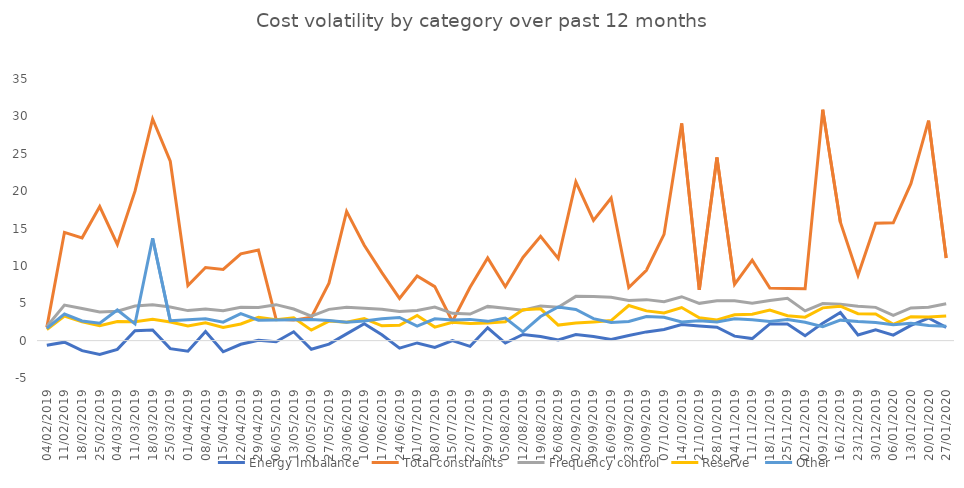
| Category | Energy Imbalance | Total constraints | Frequency control | Reserve | Other |
|---|---|---|---|---|---|
| 04/02/2019 | -0.617 | 1.772 | 1.891 | 1.495 | 1.643 |
| 11/02/2019 | -0.205 | 14.489 | 4.751 | 3.299 | 3.563 |
| 18/02/2019 | -1.342 | 13.752 | 4.289 | 2.515 | 2.635 |
| 25/02/2019 | -1.843 | 17.932 | 3.829 | 1.998 | 2.336 |
| 04/03/2019 | -1.174 | 12.864 | 3.928 | 2.569 | 4.103 |
| 11/03/2019 | 1.325 | 19.999 | 4.619 | 2.513 | 2.247 |
| 18/03/2019 | 1.423 | 29.65 | 4.798 | 2.844 | 13.688 |
| 25/03/2019 | -1.072 | 24.004 | 4.487 | 2.484 | 2.658 |
| 01/04/2019 | -1.405 | 7.368 | 4.017 | 1.95 | 2.778 |
| 08/04/2019 | 1.228 | 9.779 | 4.226 | 2.391 | 2.912 |
| 15/04/2019 | -1.495 | 9.524 | 4.007 | 1.761 | 2.468 |
| 22/04/2019 | -0.491 | 11.609 | 4.467 | 2.223 | 3.614 |
| 29/04/2019 | 0.051 | 12.118 | 4.442 | 3.122 | 2.737 |
| 06/05/2019 | -0.142 | 2.875 | 4.811 | 2.78 | 2.745 |
| 13/05/2019 | 1.189 | 2.744 | 4.226 | 3.061 | 2.801 |
| 20/05/2019 | -1.146 | 3.116 | 3.288 | 1.404 | 2.819 |
| 27/05/2019 | -0.467 | 7.685 | 4.18 | 2.612 | 2.687 |
| 03/06/2019 | 0.907 | 17.292 | 4.448 | 2.454 | 2.467 |
| 10/06/2019 | 2.27 | 12.763 | 4.332 | 2.937 | 2.625 |
| 17/06/2019 | 0.778 | 9.09 | 4.207 | 1.987 | 2.935 |
| 24/06/2019 | -1.01 | 5.643 | 3.898 | 2.049 | 3.092 |
| 01/07/2019 | -0.309 | 8.651 | 4.027 | 3.355 | 1.934 |
| 08/07/2019 | -0.918 | 7.226 | 4.484 | 1.813 | 2.915 |
| 15/07/2019 | 0.013 | 2.561 | 3.651 | 2.467 | 2.76 |
| 22/07/2019 | -0.771 | 7.14 | 3.547 | 2.281 | 2.842 |
| 29/07/2019 | 1.713 | 11.07 | 4.58 | 2.373 | 2.578 |
| 05/08/2019 | -0.328 | 7.218 | 4.318 | 2.515 | 3.013 |
| 12/08/2019 | 0.817 | 11.128 | 4.076 | 4.132 | 1.163 |
| 19/08/2019 | 0.548 | 13.958 | 4.619 | 4.254 | 3.224 |
| 26/08/2019 | 0.096 | 11.006 | 4.471 | 2.078 | 4.495 |
| 02/09/2019 | 0.803 | 21.234 | 5.92 | 2.367 | 4.172 |
| 09/09/2019 | 0.561 | 16.075 | 5.897 | 2.503 | 2.942 |
| 16/09/2019 | 0.143 | 19.073 | 5.791 | 2.687 | 2.439 |
| 23/09/2019 | 0.69 | 7.098 | 5.384 | 4.694 | 2.553 |
| 30/09/2019 | 1.167 | 9.415 | 5.484 | 3.98 | 3.23 |
| 07/10/2019 | 1.496 | 14.215 | 5.195 | 3.701 | 3.115 |
| 14/10/2019 | 2.15 | 29.052 | 5.875 | 4.43 | 2.502 |
| 21/10/2019 | 1.952 | 6.8 | 4.988 | 3.046 | 2.653 |
| 28/10/2019 | 1.798 | 24.494 | 5.318 | 2.766 | 2.483 |
| 04/11/2019 | 0.602 | 7.538 | 5.336 | 3.464 | 2.926 |
| 11/11/2019 | 0.273 | 10.759 | 5 | 3.539 | 2.786 |
| 18/11/2019 | 2.239 | 7.032 | 5.378 | 4.103 | 2.574 |
| 25/11/2019 | 2.233 | 6.965 | 5.654 | 3.342 | 2.825 |
| 02/12/2019 | 0.664 | 6.927 | 3.979 | 3.144 | 2.449 |
| 09/12/2019 | 2.34 | 30.896 | 4.967 | 4.385 | 1.872 |
| 16/12/2019 | 3.762 | 15.845 | 4.872 | 4.605 | 2.741 |
| 23/12/2019 | 0.762 | 8.755 | 4.598 | 3.6 | 2.549 |
| 30/12/2019 | 1.451 | 15.71 | 4.45 | 3.556 | 2.41 |
| 06/01/2020 | 0.732 | 15.753 | 3.371 | 2.186 | 2.122 |
| 13/01/2020 | 2.038 | 20.998 | 4.371 | 3.207 | 2.318 |
| 20/01/2020 | 3.021 | 29.429 | 4.472 | 3.156 | 2.027 |
| 27/01/2020 | 1.781 | 11.047 | 4.942 | 3.3 | 1.924 |